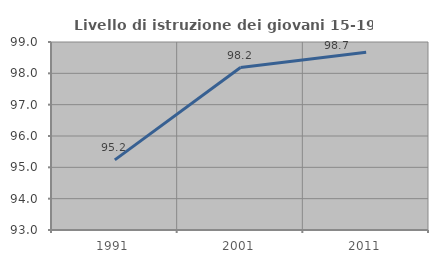
| Category | Livello di istruzione dei giovani 15-19 anni |
|---|---|
| 1991.0 | 95.238 |
| 2001.0 | 98.186 |
| 2011.0 | 98.675 |